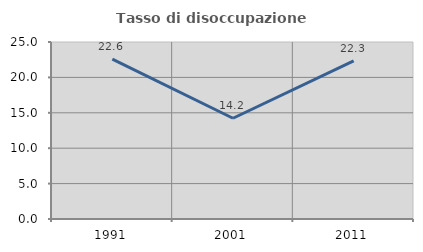
| Category | Tasso di disoccupazione giovanile  |
|---|---|
| 1991.0 | 22.588 |
| 2001.0 | 14.229 |
| 2011.0 | 22.33 |